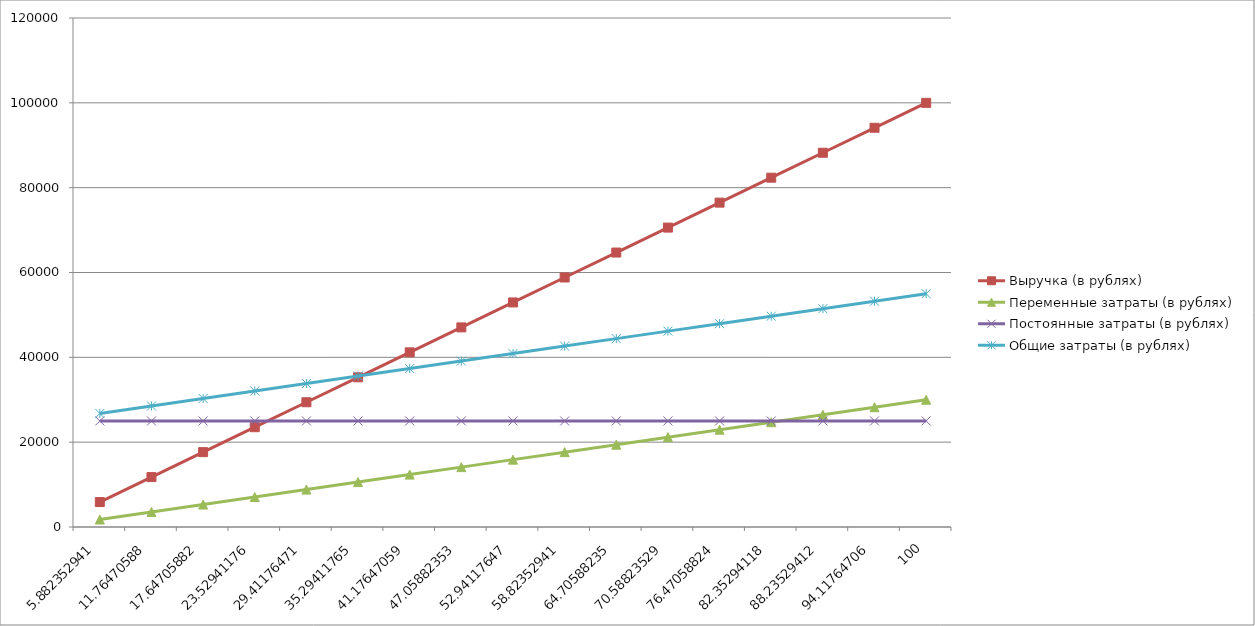
| Category | Выручка (в рублях) | Переменные затраты (в рублях) | Постоянные затраты (в рублях) | Общие затраты (в рублях) |
|---|---|---|---|---|
| 5.882352941176471 | 5882.353 | 1764.706 | 25000 | 26764.706 |
| 11.764705882352942 | 11764.706 | 3529.412 | 25000 | 28529.412 |
| 17.647058823529413 | 17647.059 | 5294.118 | 25000 | 30294.118 |
| 23.529411764705884 | 23529.412 | 7058.824 | 25000 | 32058.824 |
| 29.411764705882355 | 29411.765 | 8823.529 | 25000 | 33823.529 |
| 35.294117647058826 | 35294.118 | 10588.235 | 25000 | 35588.235 |
| 41.1764705882353 | 41176.471 | 12352.941 | 25000 | 37352.941 |
| 47.05882352941177 | 47058.824 | 14117.647 | 25000 | 39117.647 |
| 52.94117647058824 | 52941.176 | 15882.353 | 25000 | 40882.353 |
| 58.82352941176471 | 58823.529 | 17647.059 | 25000 | 42647.059 |
| 64.70588235294119 | 64705.882 | 19411.765 | 25000 | 44411.765 |
| 70.58823529411765 | 70588.235 | 21176.471 | 25000 | 46176.471 |
| 76.47058823529412 | 76470.588 | 22941.176 | 25000 | 47941.176 |
| 82.3529411764706 | 82352.941 | 24705.882 | 25000 | 49705.882 |
| 88.23529411764707 | 88235.294 | 26470.588 | 25000 | 51470.588 |
| 94.11764705882354 | 94117.647 | 28235.294 | 25000 | 53235.294 |
| 100.0 | 100000 | 30000 | 25000 | 55000 |